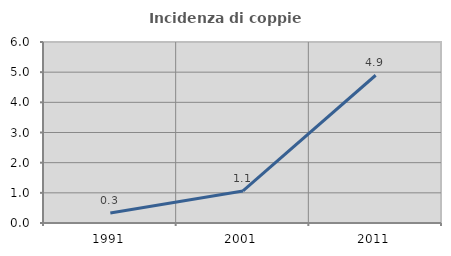
| Category | Incidenza di coppie miste |
|---|---|
| 1991.0 | 0.333 |
| 2001.0 | 1.064 |
| 2011.0 | 4.898 |